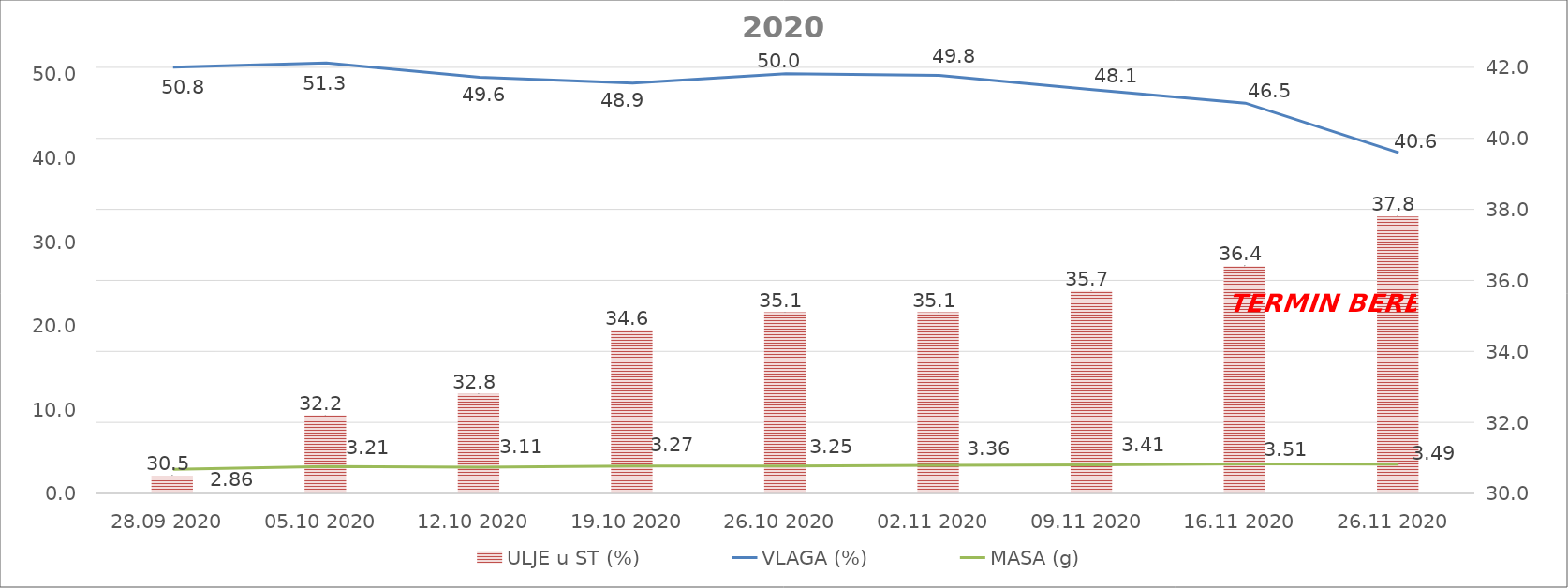
| Category | ULJE u ST (%) |
|---|---|
| 28.09 2020 | 30.5 |
| 05.10 2020 | 32.2 |
| 12.10 2020 | 32.8 |
| 19.10 2020 | 34.6 |
| 26.10 2020 | 35.1 |
| 02.11 2020 | 35.1 |
| 09.11 2020 | 35.7 |
| 16.11 2020 | 36.4 |
| 26.11 2020 | 37.8 |